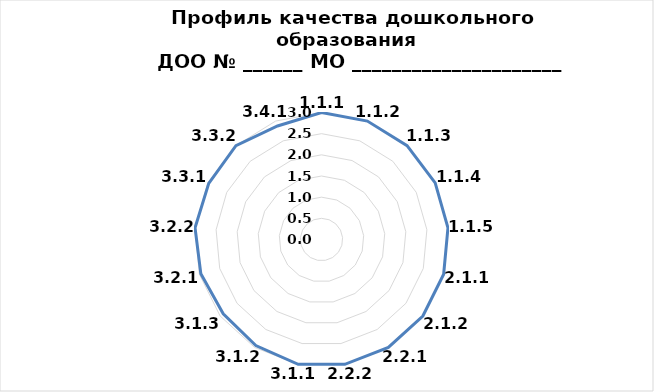
| Category | Series 0 |
|---|---|
| 1.1.1 | 3 |
| 1.1.2 | 3 |
| 1.1.3 | 3 |
| 1.1.4 | 3 |
| 1.1.5 | 3 |
| 2.1.1 | 3 |
| 2.1.2 | 3 |
| 2.2.1 | 3 |
| 2.2.2 | 3 |
| 3.1.1 | 3 |
| 3.1.2 | 2.947 |
| 3.1.3 | 2.909 |
| 3.2.1 | 2.963 |
| 3.2.2 | 3 |
| 3.3.1 | 2.975 |
| 3.3.2 | 3 |
| 3.4.1 | 2.875 |